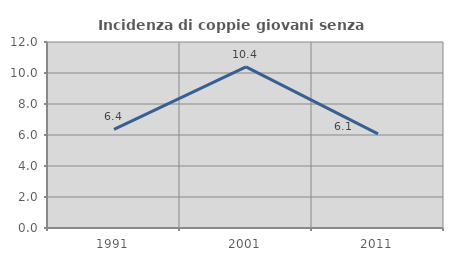
| Category | Incidenza di coppie giovani senza figli |
|---|---|
| 1991.0 | 6.367 |
| 2001.0 | 10.398 |
| 2011.0 | 6.076 |